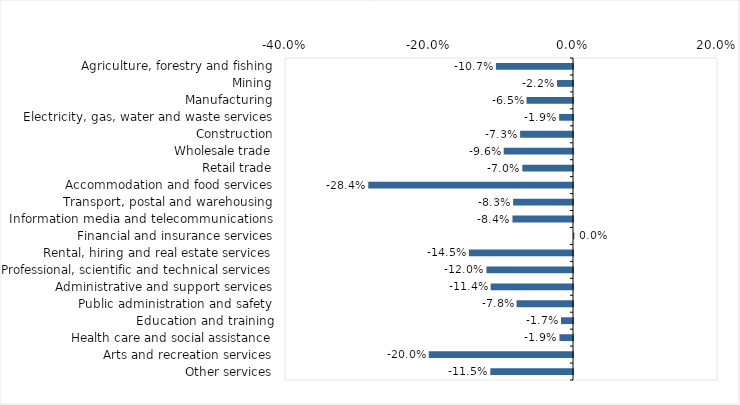
| Category | This week |
|---|---|
| Agriculture, forestry and fishing | -0.107 |
| Mining | -0.022 |
| Manufacturing | -0.065 |
| Electricity, gas, water and waste services | -0.019 |
| Construction | -0.073 |
| Wholesale trade | -0.096 |
| Retail trade | -0.07 |
| Accommodation and food services | -0.284 |
| Transport, postal and warehousing | -0.083 |
| Information media and telecommunications | -0.084 |
| Financial and insurance services | 0 |
| Rental, hiring and real estate services | -0.145 |
| Professional, scientific and technical services | -0.12 |
| Administrative and support services | -0.114 |
| Public administration and safety | -0.078 |
| Education and training | -0.017 |
| Health care and social assistance | -0.019 |
| Arts and recreation services | -0.2 |
| Other services | -0.115 |